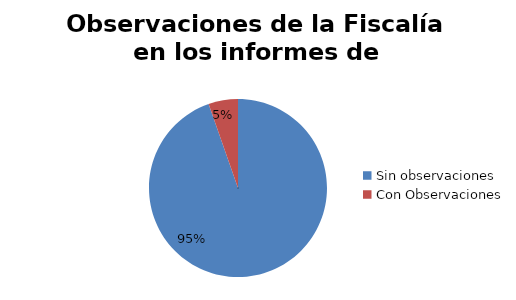
| Category | Series 0 |
|---|---|
| Sin observaciones | 53 |
| Con Observaciones | 3 |